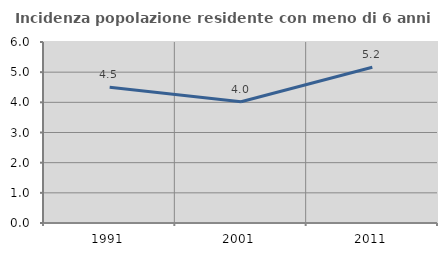
| Category | Incidenza popolazione residente con meno di 6 anni |
|---|---|
| 1991.0 | 4.499 |
| 2001.0 | 4.017 |
| 2011.0 | 5.161 |